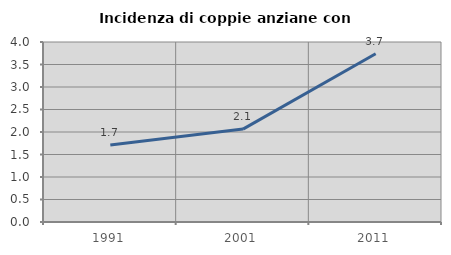
| Category | Incidenza di coppie anziane con figli |
|---|---|
| 1991.0 | 1.711 |
| 2001.0 | 2.065 |
| 2011.0 | 3.739 |